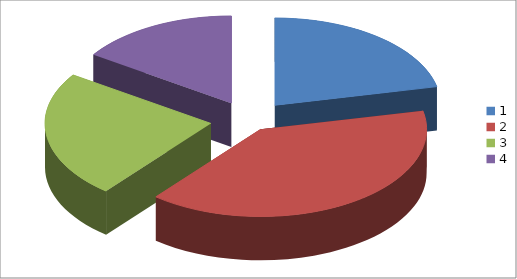
| Category | Series 0 |
|---|---|
| 0 | 0.216 |
| 1 | 0.393 |
| 2 | 0.235 |
| 3 | 0.156 |